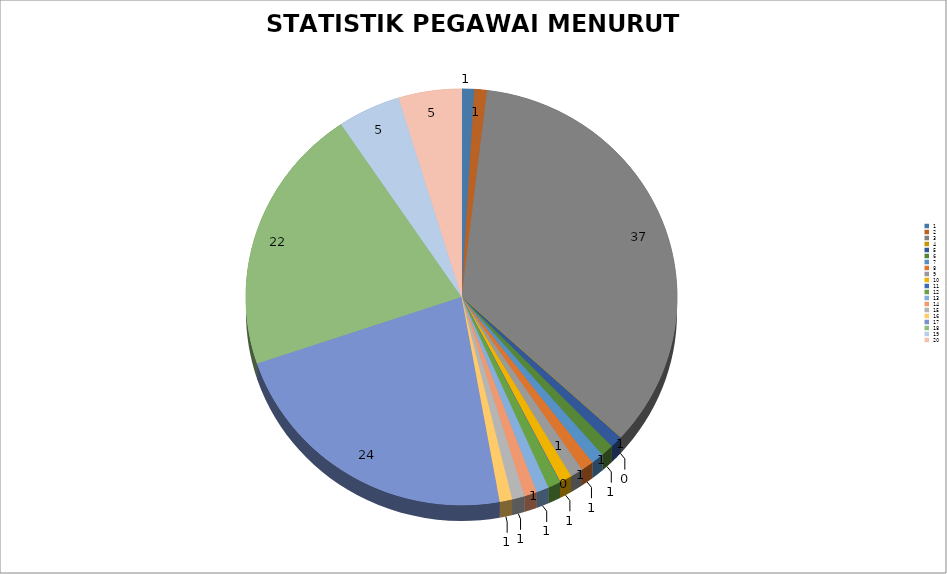
| Category | JUMLAH |
|---|---|
| 0 | 1 |
| 1 | 1 |
| 2 | 37 |
| 3 | 0 |
| 4 | 1 |
| 5 | 1 |
| 6 | 1 |
| 7 | 1 |
| 8 | 1 |
| 9 | 1 |
| 10 | 0 |
| 11 | 1 |
| 12 | 1 |
| 13 | 1 |
| 14 | 1 |
| 15 | 1 |
| 16 | 24 |
| 17 | 22 |
| 18 | 5 |
| 19 | 5 |